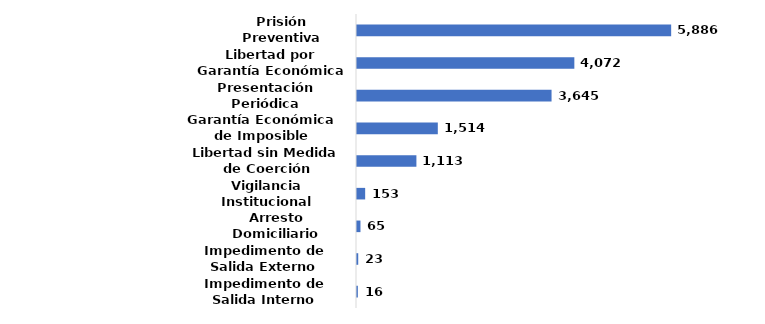
| Category | Series 0 |
|---|---|
| Impedimento de Salida Interno | 0.001 |
| Impedimento de Salida Externo | 0.001 |
| Arresto Domiciliario | 0.004 |
| Vigilancia Institucional | 0.009 |
| Libertad sin Medida de Coerción | 0.068 |
| Garantía Económica de Imposible Cumplimiento | 0.092 |
| Presentación Periódica | 0.221 |
| Libertad por Garantía Económica | 0.247 |
| Prisión Preventiva | 0.357 |